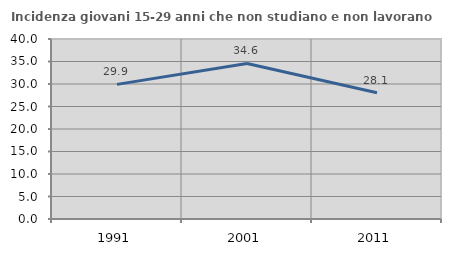
| Category | Incidenza giovani 15-29 anni che non studiano e non lavorano  |
|---|---|
| 1991.0 | 29.919 |
| 2001.0 | 34.56 |
| 2011.0 | 28.075 |